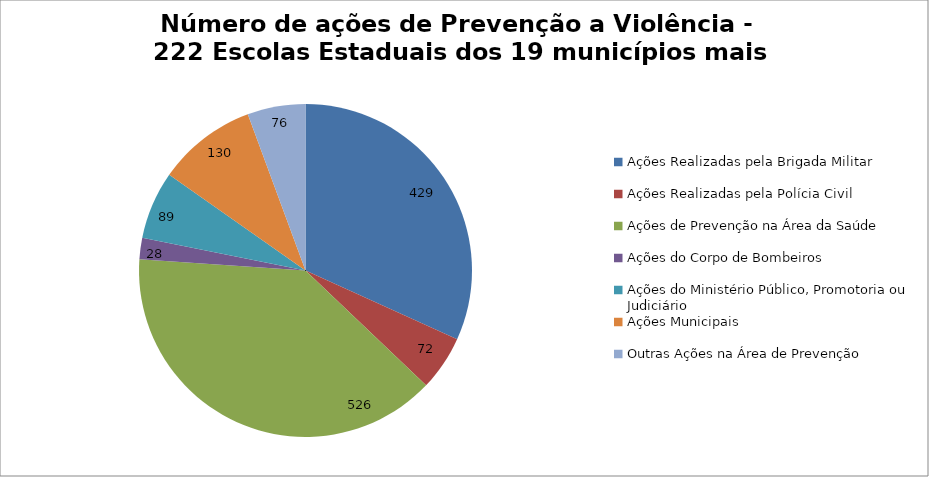
| Category | Número de Ações |
|---|---|
| Ações Realizadas pela Brigada Militar | 429 |
| Ações Realizadas pela Polícia Civil | 72 |
| Ações de Prevenção na Área da Saúde | 526 |
| Ações do Corpo de Bombeiros | 28 |
| Ações do Ministério Público, Promotoria ou Judiciário | 89 |
| Ações Municipais | 130 |
| Outras Ações na Área de Prevenção | 76 |